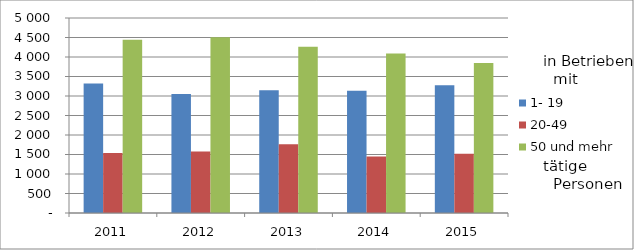
| Category | 1- 19 | 20-49 | 50 und mehr |
|---|---|---|---|
| 2011.0 | 3320 | 1536 | 4441 |
| 2012.0 | 3052 | 1576 | 4508 |
| 2013.0 | 3148 | 1760 | 4264 |
| 2014.0 | 3136 | 1450 | 4090 |
| 2015.0 | 3275 | 1522 | 3844 |